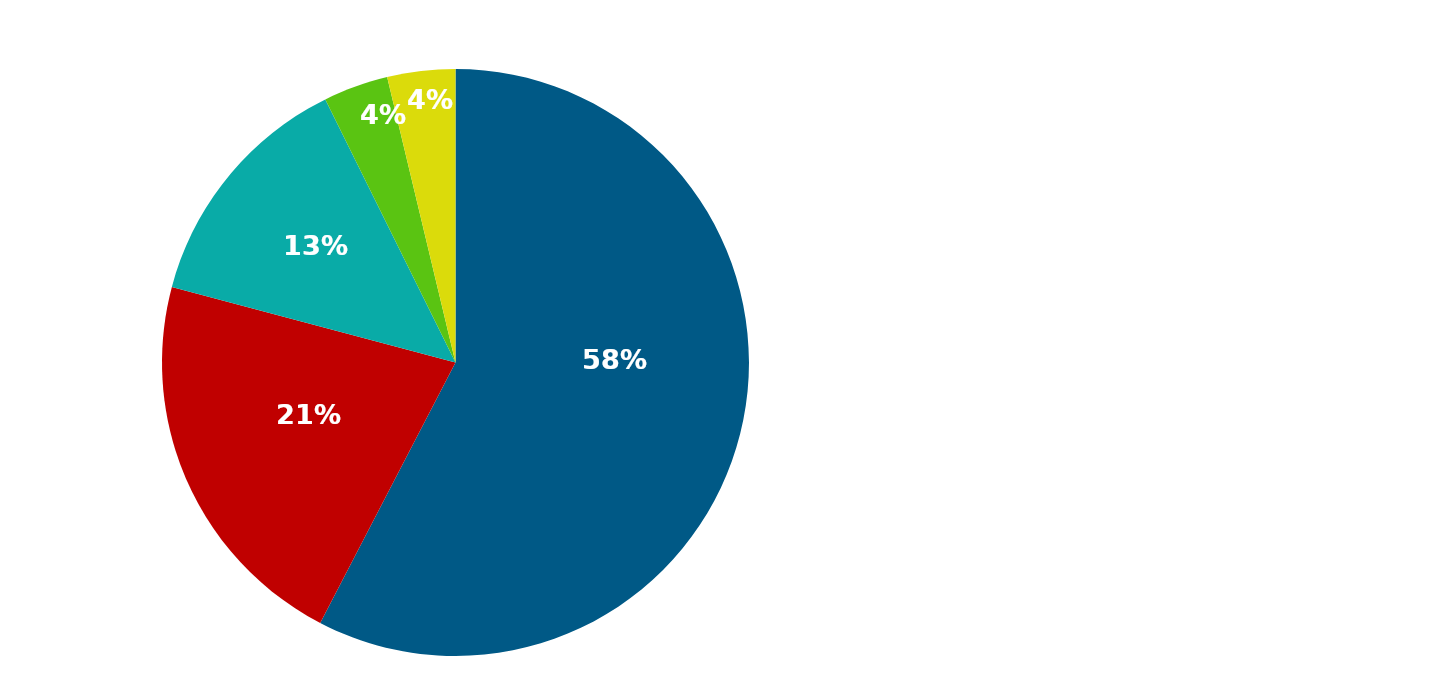
| Category | Series 0 |
|---|---|
| Salary (Includes 5 hours vacation and 5 hours sick leave) | 1500 |
| Medical Insurance ($560 the state pays) | 560 |
| Retirement * (23.51% the state pays) | 352.65 |
| Social Security ** (6.2% the state pays) | 93 |
| Other *** (LTD, Basic Life, Medicare, Retiree Medical) | 97.38 |